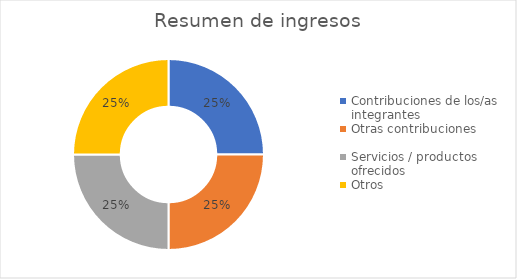
| Category | Series 0 |
|---|---|
| Contribuciones de los/as integrantes | 10 |
| Otras contribuciones | 10 |
| Servicios / productos ofrecidos | 10 |
| Otros | 10 |